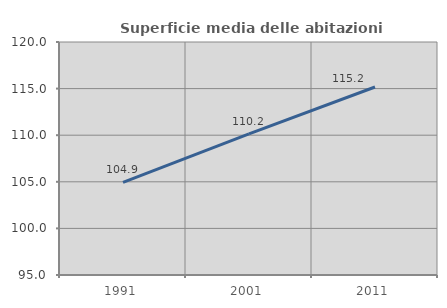
| Category | Superficie media delle abitazioni occupate |
|---|---|
| 1991.0 | 104.944 |
| 2001.0 | 110.151 |
| 2011.0 | 115.174 |